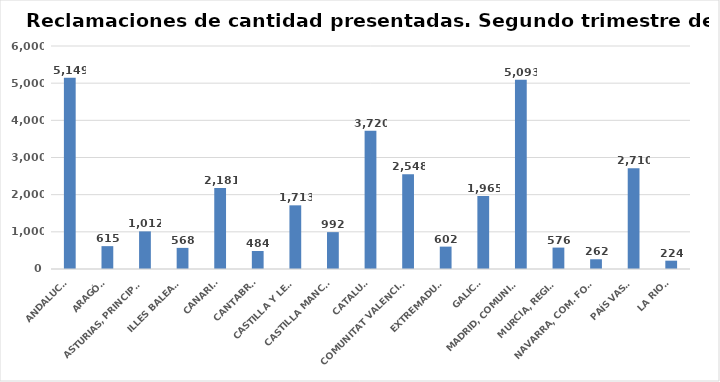
| Category | Series 0 |
|---|---|
| ANDALUCÍA | 5149 |
| ARAGÓN | 615 |
| ASTURIAS, PRINCIPADO | 1012 |
| ILLES BALEARS | 568 |
| CANARIAS | 2181 |
| CANTABRIA | 484 |
| CASTILLA Y LEÓN | 1713 |
| CASTILLA MANCHA | 992 |
| CATALUÑA | 3720 |
| COMUNITAT VALENCIANA | 2548 |
| EXTREMADURA | 602 |
| GALICIA | 1965 |
| MADRID, COMUNIDAD | 5093 |
| MURCIA, REGIÓN | 576 |
| NAVARRA, COM. FORAL | 262 |
| PAÍS VASCO | 2710 |
| LA RIOJA | 224 |